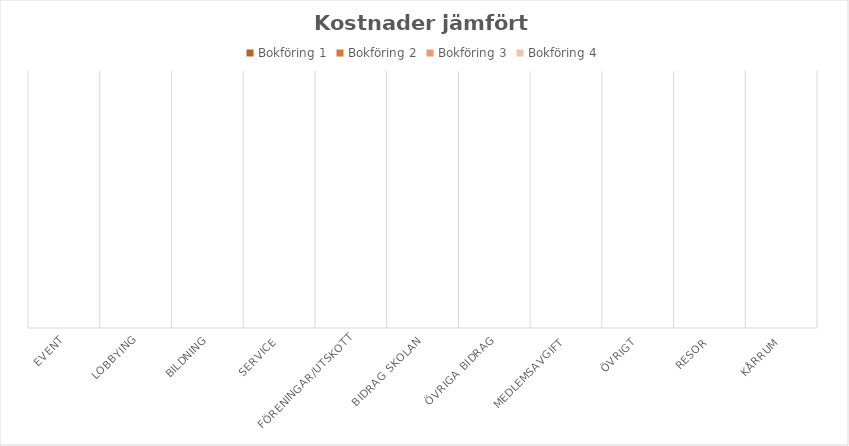
| Category | Bokföring 1 | Bokföring 2 | Bokföring 3 | Bokföring 4 |
|---|---|---|---|---|
| Event | 0 | 0 | 0 | 0 |
| Lobbying | 0 | 0 | 0 | 0 |
| Bildning | 0 | 0 | 0 | 0 |
| Service | 0 | 0 | 0 | 0 |
| Föreningar/Utskott | 0 | 0 | 0 | 0 |
| Bidrag skolan | 0 | 0 | 0 | 0 |
| Övriga bidrag | 0 | 0 | 0 | 0 |
| Medlemsavgift | 0 | 0 | 0 | 0 |
| Övrigt | 0 | 0 | 0 | 0 |
| Resor | 0 | 0 | 0 | 0 |
| Kårrum | 0 | 0 | 0 | 0 |